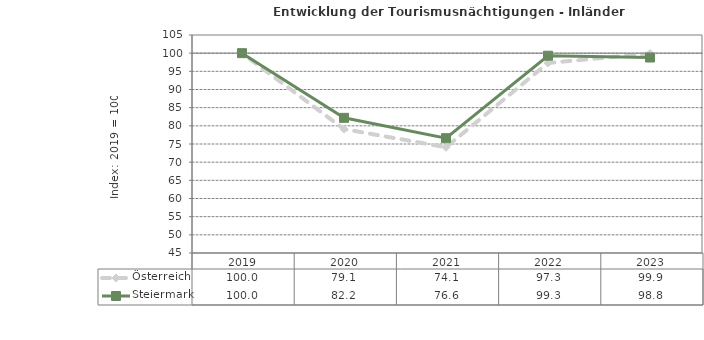
| Category | Österreich | Steiermark |
|---|---|---|
| 2023.0 | 99.9 | 98.8 |
| 2022.0 | 97.3 | 99.3 |
| 2021.0 | 74.1 | 76.6 |
| 2020.0 | 79.1 | 82.2 |
| 2019.0 | 100 | 100 |